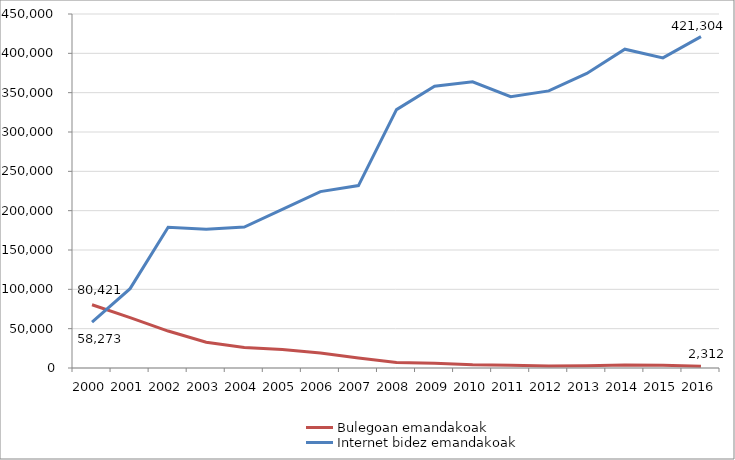
| Category | Bulegoan emandakoak | Internet bidez emandakoak |
|---|---|---|
| 2000.0 | 80421 | 58273 |
| 2001.0 | 64042 | 100869 |
| 2002.0 | 46964 | 178952 |
| 2003.0 | 32720 | 176407 |
| 2004.0 | 26096 | 179107 |
| 2005.0 | 23372 | 201707 |
| 2006.0 | 19115 | 224257 |
| 2007.0 | 12845 | 231868 |
| 2008.0 | 7134 | 328456 |
| 2009.0 | 6070 | 358211 |
| 2010.0 | 3978 | 363757 |
| 2011.0 | 3529 | 344978 |
| 2012.0 | 2560 | 352242 |
| 2013.0 | 2858 | 374439 |
| 2014.0 | 3882 | 405297 |
| 2015.0 | 3470 | 394167 |
| 2016.0 | 2312 | 421304 |